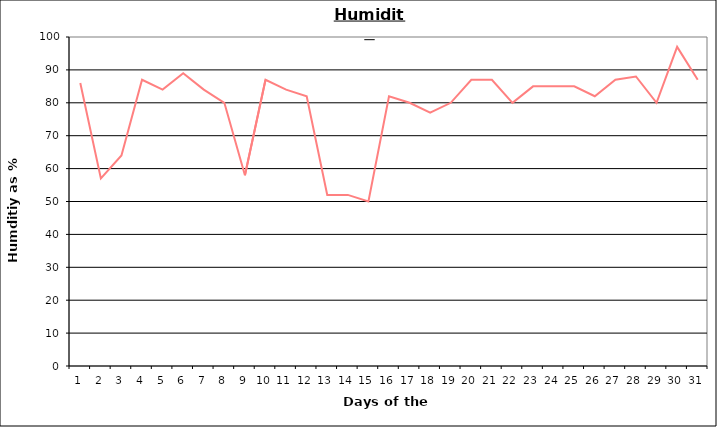
| Category | Series 0 |
|---|---|
| 0 | 86 |
| 1 | 57 |
| 2 | 64 |
| 3 | 87 |
| 4 | 84 |
| 5 | 89 |
| 6 | 84 |
| 7 | 80 |
| 8 | 58 |
| 9 | 87 |
| 10 | 84 |
| 11 | 82 |
| 12 | 52 |
| 13 | 52 |
| 14 | 50 |
| 15 | 82 |
| 16 | 80 |
| 17 | 77 |
| 18 | 80 |
| 19 | 87 |
| 20 | 87 |
| 21 | 80 |
| 22 | 85 |
| 23 | 85 |
| 24 | 85 |
| 25 | 82 |
| 26 | 87 |
| 27 | 88 |
| 28 | 80 |
| 29 | 97 |
| 30 | 87 |